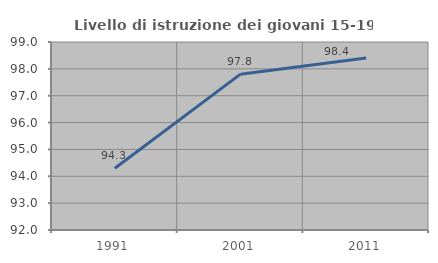
| Category | Livello di istruzione dei giovani 15-19 anni |
|---|---|
| 1991.0 | 94.297 |
| 2001.0 | 97.802 |
| 2011.0 | 98.404 |